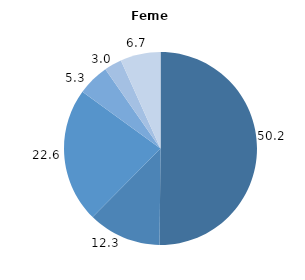
| Category | Series 0 |
|---|---|
| 0 | 50.153 |
| 1 | 12.257 |
| 2 | 22.578 |
| 3 | 5.33 |
| 4 | 2.953 |
| 5 | 6.729 |